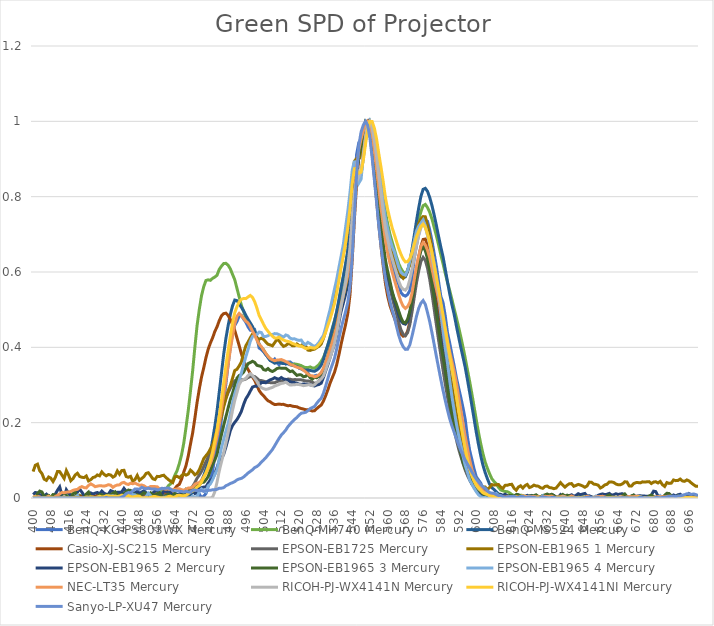
| Category | BenQ-KG-PS303WX | BenQ-MH740 | BenQ-MS524 | Casio-XJ-SC215 | EPSON-EB1725 | EPSON-EB1965 1 | EPSON-EB1965 2 | EPSON-EB1965 3 | EPSON-EB1965 4 | NEC-LT35 | RICOH-PJ-WX4141N | RICOH-PJ-WX4141NI | Sanyo-LP-XU47 |
|---|---|---|---|---|---|---|---|---|---|---|---|---|---|
| 400.0 | 0 | 0 | 0 | 0 | 0.001 | 0.07 | 0.009 | 0 | 0 | 0.003 | 0.001 | 0.001 | 0 |
| 401.0 | 0 | 0 | 0 | 0 | 0.003 | 0.087 | 0.015 | 0 | 0 | 0.004 | 0 | 0.003 | 0 |
| 402.0 | 0 | 0 | 0 | 0 | 0 | 0.09 | 0.014 | 0.012 | 0 | 0.003 | 0 | 0 | 0 |
| 403.0 | 0 | 0 | 0 | 0 | 0 | 0.072 | 0.009 | 0.018 | 0 | 0.003 | 0 | 0 | 0 |
| 404.0 | 0 | 0 | 0 | 0.001 | 0.001 | 0.065 | 0.009 | 0.016 | 0 | 0 | 0.001 | 0 | 0 |
| 405.0 | 0 | 0 | 0 | 0 | 0 | 0.05 | 0.006 | 0.004 | 0 | 0 | 0 | 0 | 0 |
| 406.0 | 0 | 0.004 | 0 | 0 | 0 | 0.047 | 0.01 | 0.005 | 0 | 0.002 | 0 | 0 | 0 |
| 407.0 | 0 | 0.007 | 0 | 0.001 | 0 | 0.056 | 0.004 | 0.007 | 0.004 | 0.005 | 0 | 0.002 | 0 |
| 408.0 | 0 | 0.001 | 0 | 0 | 0 | 0.053 | 0.004 | 0.002 | 0 | 0.001 | 0 | 0.002 | 0 |
| 409.0 | 0 | 0 | 0 | 0.001 | 0 | 0.044 | 0.005 | 0.009 | 0 | 0 | 0 | 0.001 | 0 |
| 410.0 | 0 | 0 | 0 | 0.003 | 0 | 0.054 | 0.01 | 0.008 | 0 | 0.004 | 0 | 0 | 0 |
| 411.0 | 0 | 0.007 | 0 | 0.003 | 0.002 | 0.07 | 0.021 | 0 | 0 | 0.007 | 0 | 0 | 0 |
| 412.0 | 0 | 0.005 | 0 | 0.002 | 0.005 | 0.07 | 0.029 | 0.004 | 0 | 0.011 | 0 | 0 | 0 |
| 413.0 | 0 | 0 | 0 | 0.001 | 0.001 | 0.061 | 0.008 | 0.001 | 0 | 0.015 | 0 | 0 | 0 |
| 414.0 | 0 | 0.001 | 0 | 0.001 | 0 | 0.052 | 0 | 0.008 | 0 | 0.014 | 0.004 | 0 | 0 |
| 415.0 | 0 | 0.006 | 0 | 0.001 | 0.001 | 0.073 | 0.022 | 0.005 | 0 | 0.016 | 0 | 0 | 0 |
| 416.0 | 0 | 0.007 | 0 | 0 | 0 | 0.061 | 0.013 | 0 | 0 | 0.016 | 0 | 0 | 0 |
| 417.0 | 0 | 0.01 | 0 | 0 | 0 | 0.046 | 0.007 | 0 | 0 | 0.017 | 0 | 0 | 0 |
| 418.0 | 0 | 0.004 | 0 | 0 | 0 | 0.051 | 0.002 | 0.011 | 0 | 0.02 | 0 | 0.001 | 0 |
| 419.0 | 0 | 0 | 0 | 0 | 0 | 0.061 | 0.004 | 0.016 | 0.001 | 0.022 | 0 | 0.002 | 0 |
| 420.0 | 0 | 0.002 | 0 | 0.002 | 0 | 0.066 | 0.016 | 0.001 | 0.007 | 0.023 | 0 | 0.001 | 0 |
| 421.0 | 0 | 0.007 | 0 | 0.005 | 0 | 0.057 | 0.024 | 0 | 0 | 0.028 | 0 | 0.001 | 0 |
| 422.0 | 0 | 0.005 | 0 | 0.004 | 0 | 0.055 | 0.016 | 0 | 0 | 0.03 | 0 | 0 | 0 |
| 423.0 | 0 | 0.002 | 0 | 0.001 | 0 | 0.054 | 0.007 | 0 | 0 | 0.028 | 0 | 0 | 0 |
| 424.0 | 0 | 0.003 | 0 | 0.001 | 0 | 0.058 | 0.007 | 0.01 | 0 | 0.027 | 0 | 0.003 | 0 |
| 425.0 | 0 | 0.008 | 0 | 0.004 | 0.001 | 0.045 | 0.008 | 0.016 | 0 | 0.033 | 0 | 0.002 | 0 |
| 426.0 | 0 | 0.009 | 0 | 0.009 | 0.001 | 0.049 | 0.013 | 0.002 | 0 | 0.038 | 0 | 0.003 | 0 |
| 427.0 | 0 | 0.006 | 0 | 0.006 | 0 | 0.054 | 0.01 | 0 | 0 | 0.034 | 0 | 0.002 | 0 |
| 428.0 | 0 | 0.002 | 0 | 0.003 | 0.001 | 0.056 | 0.013 | 0 | 0 | 0.03 | 0 | 0 | 0 |
| 429.0 | 0 | 0.003 | 0 | 0.008 | 0.003 | 0.061 | 0.015 | 0 | 0 | 0.031 | 0 | 0.002 | 0 |
| 430.0 | 0 | 0.009 | 0.001 | 0.007 | 0.003 | 0.059 | 0.011 | 0.009 | 0 | 0.033 | 0 | 0.005 | 0 |
| 431.0 | 0 | 0.009 | 0 | 0.004 | 0.004 | 0.069 | 0.018 | 0.008 | 0 | 0.032 | 0 | 0.003 | 0 |
| 432.0 | 0 | 0.005 | 0 | 0.006 | 0.005 | 0.063 | 0.013 | 0.003 | 0 | 0.031 | 0 | 0.003 | 0 |
| 433.0 | 0 | 0.006 | 0.001 | 0.008 | 0.007 | 0.059 | 0.01 | 0.007 | 0 | 0.033 | 0 | 0.006 | 0.001 |
| 434.0 | 0 | 0.007 | 0 | 0.009 | 0.007 | 0.062 | 0.01 | 0.008 | 0.006 | 0.035 | 0 | 0.005 | 0 |
| 435.0 | 0 | 0.007 | 0 | 0.01 | 0.009 | 0.061 | 0.02 | 0.008 | 0.005 | 0.034 | 0 | 0.004 | 0 |
| 436.0 | 0 | 0.003 | 0 | 0.009 | 0.011 | 0.055 | 0.017 | 0.013 | 0.006 | 0.028 | 0 | 0.004 | 0 |
| 437.0 | 0 | 0 | 0 | 0.01 | 0.011 | 0.059 | 0.008 | 0.016 | 0 | 0.032 | 0 | 0.005 | 0 |
| 438.0 | 0 | 0.002 | 0 | 0.009 | 0.013 | 0.072 | 0.015 | 0.008 | 0 | 0.034 | 0 | 0.004 | 0 |
| 439.0 | 0 | 0.009 | 0 | 0.009 | 0.014 | 0.063 | 0.015 | 0.003 | 0 | 0.035 | 0 | 0.005 | 0 |
| 440.0 | 0 | 0.01 | 0 | 0.01 | 0.015 | 0.073 | 0.016 | 0.008 | 0.003 | 0.04 | 0 | 0.007 | 0.002 |
| 441.0 | 0 | 0.007 | 0 | 0.013 | 0.011 | 0.074 | 0.026 | 0.011 | 0.001 | 0.041 | 0 | 0.006 | 0.005 |
| 442.0 | 0 | 0.005 | 0.002 | 0.013 | 0.011 | 0.057 | 0.018 | 0.017 | 0 | 0.038 | 0 | 0.006 | 0.012 |
| 443.0 | 0 | 0.004 | 0 | 0.01 | 0.013 | 0.055 | 0.01 | 0.021 | 0.004 | 0.036 | 0 | 0.007 | 0.014 |
| 444.0 | 0 | 0.007 | 0 | 0.011 | 0.013 | 0.057 | 0.019 | 0.02 | 0.013 | 0.039 | 0 | 0.004 | 0.014 |
| 445.0 | 0 | 0.007 | 0 | 0.01 | 0.014 | 0.044 | 0.013 | 0.012 | 0.009 | 0.038 | 0 | 0.003 | 0.019 |
| 446.0 | 0 | 0.01 | 0.003 | 0.01 | 0.014 | 0.049 | 0.011 | 0.009 | 0.008 | 0.04 | 0 | 0.004 | 0.024 |
| 447.0 | 0 | 0.009 | 0.003 | 0.012 | 0.014 | 0.06 | 0.019 | 0.009 | 0.003 | 0.036 | 0 | 0.005 | 0.024 |
| 448.0 | 0 | 0.008 | 0.003 | 0.011 | 0.012 | 0.047 | 0.012 | 0.006 | 0 | 0.034 | 0 | 0.005 | 0.023 |
| 449.0 | 0 | 0.015 | 0.005 | 0.01 | 0.012 | 0.052 | 0.016 | 0.01 | 0 | 0.034 | 0 | 0 | 0.028 |
| 450.0 | 0 | 0.017 | 0.005 | 0.008 | 0.011 | 0.057 | 0.019 | 0.014 | 0 | 0.033 | 0 | 0 | 0.026 |
| 451.0 | 0 | 0.013 | 0 | 0.009 | 0.011 | 0.065 | 0.014 | 0.011 | 0.004 | 0.028 | 0 | 0.001 | 0.024 |
| 452.0 | 0 | 0.011 | 0 | 0.012 | 0.01 | 0.067 | 0.007 | 0.011 | 0.013 | 0.026 | 0 | 0 | 0.026 |
| 453.0 | 0 | 0.01 | 0 | 0.012 | 0.008 | 0.06 | 0.01 | 0.014 | 0.007 | 0.031 | 0 | 0.002 | 0.024 |
| 454.0 | 0 | 0.012 | 0 | 0.01 | 0.007 | 0.051 | 0.013 | 0.009 | 0 | 0.03 | 0 | 0.004 | 0.024 |
| 455.0 | 0 | 0.014 | 0 | 0.011 | 0.008 | 0.049 | 0.018 | 0.007 | 0 | 0.03 | 0 | 0.004 | 0.024 |
| 456.0 | 0 | 0.016 | 0 | 0.01 | 0.007 | 0.057 | 0.022 | 0.011 | 0 | 0.03 | 0 | 0.002 | 0.022 |
| 457.0 | 0 | 0.018 | 0 | 0.007 | 0.006 | 0.057 | 0.012 | 0.014 | 0 | 0.024 | 0 | 0.001 | 0.022 |
| 458.0 | 0 | 0.02 | 0.002 | 0.011 | 0.006 | 0.059 | 0.01 | 0.005 | 0 | 0.025 | 0 | 0 | 0.026 |
| 459.0 | 0 | 0.019 | 0 | 0.013 | 0.008 | 0.06 | 0.018 | 0.001 | 0.002 | 0.024 | 0 | 0 | 0.025 |
| 460.0 | 0 | 0.022 | 0 | 0.012 | 0.007 | 0.054 | 0.018 | 0.007 | 0.003 | 0.023 | 0 | 0.001 | 0.026 |
| 461.0 | 0 | 0.032 | 0 | 0.016 | 0.009 | 0.049 | 0.016 | 0.01 | 0 | 0.025 | 0 | 0.004 | 0.027 |
| 462.0 | 0 | 0.037 | 0 | 0.017 | 0.01 | 0.045 | 0.014 | 0.005 | 0 | 0.024 | 0 | 0.005 | 0.024 |
| 463.0 | 0 | 0.047 | 0.001 | 0.018 | 0.009 | 0.041 | 0.007 | 0.006 | 0 | 0.022 | 0 | 0.002 | 0.019 |
| 464.0 | 0 | 0.061 | 0.001 | 0.025 | 0.01 | 0.056 | 0.006 | 0.014 | 0.003 | 0.023 | 0 | 0.002 | 0.02 |
| 465.0 | 0 | 0.073 | 0 | 0.032 | 0.008 | 0.058 | 0.009 | 0.007 | 0 | 0.024 | 0 | 0.007 | 0.019 |
| 466.0 | 0 | 0.092 | 0 | 0.036 | 0.008 | 0.054 | 0.009 | 0 | 0 | 0.024 | 0 | 0.007 | 0.018 |
| 467.0 | 0 | 0.115 | 0.002 | 0.05 | 0.009 | 0.059 | 0.017 | 0.004 | 0 | 0.022 | 0 | 0.006 | 0.017 |
| 468.0 | 0 | 0.146 | 0.005 | 0.069 | 0.012 | 0.064 | 0.018 | 0.015 | 0 | 0.021 | 0 | 0.006 | 0.016 |
| 469.0 | 0 | 0.187 | 0.005 | 0.086 | 0.017 | 0.061 | 0.016 | 0.023 | 0 | 0.023 | 0 | 0.007 | 0.018 |
| 470.0 | 0 | 0.232 | 0.005 | 0.111 | 0.019 | 0.063 | 0.02 | 0.021 | 0 | 0.026 | 0 | 0.011 | 0.016 |
| 471.0 | 0 | 0.283 | 0.009 | 0.143 | 0.024 | 0.074 | 0.022 | 0.018 | 0 | 0.027 | 0 | 0.016 | 0.015 |
| 472.0 | 0 | 0.338 | 0.016 | 0.173 | 0.031 | 0.069 | 0.02 | 0.019 | 0.004 | 0.029 | 0 | 0.018 | 0.02 |
| 473.0 | 0 | 0.4 | 0.022 | 0.212 | 0.041 | 0.062 | 0.012 | 0.026 | 0.003 | 0.037 | 0 | 0.023 | 0.021 |
| 474.0 | 0 | 0.458 | 0.025 | 0.254 | 0.052 | 0.065 | 0.013 | 0.032 | 0.004 | 0.04 | 0 | 0.029 | 0.02 |
| 475.0 | 0.011 | 0.501 | 0.033 | 0.29 | 0.061 | 0.075 | 0.025 | 0.038 | 0.017 | 0.041 | 0 | 0.033 | 0.02 |
| 476.0 | 0.001 | 0.537 | 0.045 | 0.321 | 0.07 | 0.089 | 0.027 | 0.041 | 0.024 | 0.047 | 0 | 0.042 | 0.02 |
| 477.0 | 0.005 | 0.561 | 0.06 | 0.346 | 0.083 | 0.105 | 0.029 | 0.042 | 0.019 | 0.056 | 0 | 0.055 | 0.018 |
| 478.0 | 0.012 | 0.578 | 0.077 | 0.372 | 0.096 | 0.112 | 0.029 | 0.048 | 0.017 | 0.065 | 0 | 0.067 | 0.02 |
| 479.0 | 0.03 | 0.579 | 0.096 | 0.395 | 0.109 | 0.119 | 0.04 | 0.057 | 0.032 | 0.078 | 0 | 0.082 | 0.02 |
| 480.0 | 0.05 | 0.578 | 0.121 | 0.411 | 0.121 | 0.13 | 0.047 | 0.073 | 0.037 | 0.092 | 0 | 0.1 | 0.02 |
| 481.0 | 0.07 | 0.583 | 0.154 | 0.425 | 0.137 | 0.141 | 0.052 | 0.09 | 0.049 | 0.109 | 0.002 | 0.123 | 0.022 |
| 482.0 | 0.11 | 0.587 | 0.19 | 0.442 | 0.157 | 0.159 | 0.063 | 0.101 | 0.063 | 0.137 | 0.016 | 0.151 | 0.022 |
| 483.0 | 0.138 | 0.591 | 0.231 | 0.454 | 0.177 | 0.182 | 0.081 | 0.116 | 0.074 | 0.163 | 0.042 | 0.181 | 0.023 |
| 484.0 | 0.164 | 0.607 | 0.281 | 0.471 | 0.201 | 0.199 | 0.098 | 0.142 | 0.105 | 0.195 | 0.072 | 0.218 | 0.026 |
| 485.0 | 0.21 | 0.615 | 0.331 | 0.484 | 0.224 | 0.217 | 0.104 | 0.168 | 0.133 | 0.235 | 0.095 | 0.259 | 0.026 |
| 486.0 | 0.258 | 0.623 | 0.381 | 0.489 | 0.246 | 0.242 | 0.116 | 0.193 | 0.155 | 0.275 | 0.119 | 0.305 | 0.027 |
| 487.0 | 0.303 | 0.623 | 0.423 | 0.491 | 0.265 | 0.264 | 0.135 | 0.216 | 0.177 | 0.312 | 0.146 | 0.351 | 0.033 |
| 488.0 | 0.353 | 0.618 | 0.457 | 0.484 | 0.28 | 0.285 | 0.157 | 0.239 | 0.197 | 0.354 | 0.173 | 0.391 | 0.035 |
| 489.0 | 0.401 | 0.608 | 0.487 | 0.474 | 0.292 | 0.299 | 0.179 | 0.261 | 0.224 | 0.394 | 0.202 | 0.43 | 0.039 |
| 490.0 | 0.437 | 0.594 | 0.51 | 0.461 | 0.302 | 0.318 | 0.192 | 0.278 | 0.252 | 0.43 | 0.233 | 0.465 | 0.041 |
| 491.0 | 0.458 | 0.579 | 0.525 | 0.445 | 0.311 | 0.338 | 0.201 | 0.299 | 0.277 | 0.463 | 0.259 | 0.492 | 0.043 |
| 492.0 | 0.468 | 0.556 | 0.524 | 0.425 | 0.311 | 0.342 | 0.208 | 0.318 | 0.294 | 0.483 | 0.28 | 0.508 | 0.048 |
| 493.0 | 0.483 | 0.534 | 0.516 | 0.405 | 0.312 | 0.351 | 0.218 | 0.325 | 0.313 | 0.49 | 0.301 | 0.521 | 0.051 |
| 494.0 | 0.485 | 0.512 | 0.506 | 0.383 | 0.314 | 0.361 | 0.23 | 0.328 | 0.332 | 0.484 | 0.311 | 0.528 | 0.052 |
| 495.0 | 0.475 | 0.495 | 0.497 | 0.365 | 0.314 | 0.385 | 0.248 | 0.334 | 0.355 | 0.476 | 0.315 | 0.53 | 0.056 |
| 496.0 | 0.467 | 0.48 | 0.485 | 0.351 | 0.316 | 0.404 | 0.263 | 0.346 | 0.375 | 0.47 | 0.317 | 0.529 | 0.061 |
| 497.0 | 0.454 | 0.469 | 0.474 | 0.341 | 0.32 | 0.414 | 0.272 | 0.357 | 0.394 | 0.465 | 0.325 | 0.534 | 0.066 |
| 498.0 | 0.445 | 0.462 | 0.465 | 0.331 | 0.322 | 0.425 | 0.284 | 0.359 | 0.416 | 0.455 | 0.33 | 0.538 | 0.07 |
| 499.0 | 0.444 | 0.452 | 0.455 | 0.321 | 0.324 | 0.435 | 0.294 | 0.363 | 0.429 | 0.443 | 0.325 | 0.533 | 0.075 |
| 500.0 | 0.447 | 0.442 | 0.441 | 0.312 | 0.322 | 0.435 | 0.297 | 0.36 | 0.432 | 0.432 | 0.317 | 0.521 | 0.081 |
| 501.0 | 0.426 | 0.425 | 0.424 | 0.299 | 0.318 | 0.424 | 0.297 | 0.352 | 0.434 | 0.419 | 0.309 | 0.504 | 0.084 |
| 502.0 | 0.398 | 0.407 | 0.408 | 0.285 | 0.312 | 0.422 | 0.299 | 0.351 | 0.441 | 0.408 | 0.298 | 0.485 | 0.088 |
| 503.0 | 0.394 | 0.4 | 0.398 | 0.277 | 0.312 | 0.424 | 0.307 | 0.349 | 0.439 | 0.402 | 0.293 | 0.473 | 0.095 |
| 504.0 | 0.388 | 0.394 | 0.39 | 0.272 | 0.31 | 0.421 | 0.307 | 0.341 | 0.429 | 0.392 | 0.29 | 0.461 | 0.101 |
| 505.0 | 0.38 | 0.383 | 0.382 | 0.264 | 0.308 | 0.414 | 0.306 | 0.339 | 0.429 | 0.384 | 0.288 | 0.45 | 0.107 |
| 506.0 | 0.375 | 0.376 | 0.372 | 0.258 | 0.307 | 0.408 | 0.31 | 0.344 | 0.431 | 0.376 | 0.289 | 0.443 | 0.114 |
| 507.0 | 0.366 | 0.37 | 0.365 | 0.255 | 0.306 | 0.406 | 0.314 | 0.338 | 0.434 | 0.37 | 0.292 | 0.435 | 0.121 |
| 508.0 | 0.363 | 0.364 | 0.362 | 0.251 | 0.306 | 0.404 | 0.316 | 0.336 | 0.434 | 0.367 | 0.294 | 0.429 | 0.129 |
| 509.0 | 0.369 | 0.362 | 0.358 | 0.248 | 0.306 | 0.412 | 0.319 | 0.339 | 0.436 | 0.365 | 0.297 | 0.425 | 0.138 |
| 510.0 | 0.36 | 0.362 | 0.359 | 0.249 | 0.309 | 0.42 | 0.317 | 0.343 | 0.436 | 0.366 | 0.299 | 0.425 | 0.149 |
| 511.0 | 0.354 | 0.362 | 0.361 | 0.249 | 0.311 | 0.417 | 0.316 | 0.345 | 0.433 | 0.367 | 0.301 | 0.427 | 0.158 |
| 512.0 | 0.364 | 0.36 | 0.358 | 0.249 | 0.31 | 0.409 | 0.32 | 0.345 | 0.43 | 0.368 | 0.304 | 0.423 | 0.167 |
| 513.0 | 0.362 | 0.357 | 0.357 | 0.249 | 0.312 | 0.402 | 0.316 | 0.344 | 0.427 | 0.365 | 0.305 | 0.419 | 0.173 |
| 514.0 | 0.356 | 0.357 | 0.357 | 0.247 | 0.314 | 0.405 | 0.315 | 0.345 | 0.433 | 0.362 | 0.308 | 0.417 | 0.18 |
| 515.0 | 0.361 | 0.359 | 0.356 | 0.245 | 0.316 | 0.409 | 0.313 | 0.34 | 0.431 | 0.359 | 0.304 | 0.416 | 0.189 |
| 516.0 | 0.361 | 0.356 | 0.354 | 0.246 | 0.315 | 0.409 | 0.308 | 0.336 | 0.424 | 0.355 | 0.3 | 0.414 | 0.196 |
| 517.0 | 0.356 | 0.354 | 0.352 | 0.244 | 0.314 | 0.404 | 0.307 | 0.337 | 0.422 | 0.353 | 0.3 | 0.41 | 0.203 |
| 518.0 | 0.355 | 0.356 | 0.351 | 0.243 | 0.314 | 0.404 | 0.306 | 0.331 | 0.423 | 0.35 | 0.301 | 0.409 | 0.209 |
| 519.0 | 0.35 | 0.355 | 0.349 | 0.242 | 0.314 | 0.409 | 0.305 | 0.325 | 0.42 | 0.347 | 0.302 | 0.406 | 0.213 |
| 520.0 | 0.345 | 0.353 | 0.346 | 0.239 | 0.314 | 0.405 | 0.302 | 0.327 | 0.418 | 0.345 | 0.301 | 0.403 | 0.22 |
| 521.0 | 0.35 | 0.351 | 0.343 | 0.238 | 0.314 | 0.404 | 0.301 | 0.327 | 0.419 | 0.343 | 0.3 | 0.403 | 0.225 |
| 522.0 | 0.345 | 0.348 | 0.34 | 0.236 | 0.312 | 0.41 | 0.303 | 0.322 | 0.41 | 0.339 | 0.298 | 0.4 | 0.226 |
| 523.0 | 0.337 | 0.346 | 0.339 | 0.234 | 0.311 | 0.404 | 0.302 | 0.323 | 0.407 | 0.335 | 0.299 | 0.397 | 0.228 |
| 524.0 | 0.333 | 0.346 | 0.34 | 0.234 | 0.311 | 0.393 | 0.302 | 0.329 | 0.413 | 0.329 | 0.3 | 0.398 | 0.232 |
| 525.0 | 0.323 | 0.348 | 0.339 | 0.233 | 0.31 | 0.392 | 0.301 | 0.319 | 0.41 | 0.325 | 0.3 | 0.399 | 0.237 |
| 526.0 | 0.321 | 0.345 | 0.337 | 0.231 | 0.307 | 0.394 | 0.299 | 0.316 | 0.405 | 0.324 | 0.298 | 0.399 | 0.24 |
| 527.0 | 0.324 | 0.345 | 0.336 | 0.232 | 0.304 | 0.395 | 0.297 | 0.32 | 0.403 | 0.322 | 0.3 | 0.398 | 0.243 |
| 528.0 | 0.326 | 0.349 | 0.34 | 0.237 | 0.306 | 0.399 | 0.3 | 0.319 | 0.406 | 0.323 | 0.307 | 0.401 | 0.252 |
| 529.0 | 0.322 | 0.354 | 0.345 | 0.242 | 0.311 | 0.403 | 0.301 | 0.324 | 0.413 | 0.327 | 0.311 | 0.407 | 0.259 |
| 530.0 | 0.326 | 0.363 | 0.352 | 0.247 | 0.319 | 0.409 | 0.305 | 0.331 | 0.423 | 0.333 | 0.316 | 0.415 | 0.264 |
| 531.0 | 0.338 | 0.373 | 0.367 | 0.257 | 0.331 | 0.423 | 0.32 | 0.341 | 0.431 | 0.344 | 0.324 | 0.425 | 0.278 |
| 532.0 | 0.352 | 0.388 | 0.388 | 0.271 | 0.349 | 0.443 | 0.337 | 0.358 | 0.452 | 0.36 | 0.339 | 0.44 | 0.297 |
| 533.0 | 0.37 | 0.406 | 0.406 | 0.287 | 0.369 | 0.468 | 0.354 | 0.377 | 0.477 | 0.377 | 0.357 | 0.458 | 0.317 |
| 534.0 | 0.4 | 0.427 | 0.425 | 0.305 | 0.389 | 0.489 | 0.373 | 0.395 | 0.5 | 0.394 | 0.372 | 0.475 | 0.337 |
| 535.0 | 0.423 | 0.45 | 0.448 | 0.319 | 0.409 | 0.51 | 0.391 | 0.417 | 0.527 | 0.414 | 0.391 | 0.494 | 0.354 |
| 536.0 | 0.439 | 0.471 | 0.469 | 0.334 | 0.426 | 0.536 | 0.408 | 0.439 | 0.554 | 0.434 | 0.41 | 0.516 | 0.371 |
| 537.0 | 0.466 | 0.494 | 0.495 | 0.354 | 0.449 | 0.558 | 0.432 | 0.459 | 0.58 | 0.456 | 0.437 | 0.544 | 0.396 |
| 538.0 | 0.499 | 0.522 | 0.526 | 0.38 | 0.478 | 0.586 | 0.466 | 0.486 | 0.612 | 0.484 | 0.473 | 0.578 | 0.424 |
| 539.0 | 0.529 | 0.556 | 0.559 | 0.408 | 0.507 | 0.62 | 0.496 | 0.514 | 0.642 | 0.513 | 0.509 | 0.611 | 0.451 |
| 540.0 | 0.555 | 0.585 | 0.589 | 0.435 | 0.532 | 0.646 | 0.518 | 0.536 | 0.673 | 0.539 | 0.539 | 0.643 | 0.473 |
| 541.0 | 0.586 | 0.616 | 0.621 | 0.46 | 0.554 | 0.678 | 0.541 | 0.559 | 0.718 | 0.564 | 0.573 | 0.677 | 0.494 |
| 542.0 | 0.618 | 0.654 | 0.657 | 0.489 | 0.58 | 0.718 | 0.567 | 0.586 | 0.761 | 0.591 | 0.614 | 0.718 | 0.519 |
| 543.0 | 0.663 | 0.701 | 0.711 | 0.539 | 0.626 | 0.774 | 0.607 | 0.625 | 0.811 | 0.631 | 0.665 | 0.769 | 0.56 |
| 544.0 | 0.747 | 0.772 | 0.788 | 0.632 | 0.714 | 0.851 | 0.693 | 0.705 | 0.869 | 0.706 | 0.748 | 0.834 | 0.64 |
| 545.0 | 0.84 | 0.839 | 0.845 | 0.741 | 0.806 | 0.894 | 0.791 | 0.798 | 0.895 | 0.799 | 0.814 | 0.874 | 0.75 |
| 546.0 | 0.912 | 0.881 | 0.859 | 0.836 | 0.868 | 0.901 | 0.865 | 0.867 | 0.872 | 0.876 | 0.84 | 0.874 | 0.859 |
| 547.0 | 0.944 | 0.902 | 0.853 | 0.905 | 0.904 | 0.901 | 0.916 | 0.908 | 0.836 | 0.925 | 0.852 | 0.862 | 0.937 |
| 548.0 | 0.95 | 0.915 | 0.861 | 0.945 | 0.931 | 0.907 | 0.943 | 0.932 | 0.846 | 0.953 | 0.87 | 0.865 | 0.971 |
| 549.0 | 0.967 | 0.942 | 0.903 | 0.975 | 0.965 | 0.937 | 0.97 | 0.971 | 0.907 | 0.974 | 0.912 | 0.896 | 0.99 |
| 550.0 | 0.983 | 0.972 | 0.95 | 0.998 | 0.993 | 0.979 | 0.995 | 1 | 0.953 | 0.992 | 0.96 | 0.939 | 1 |
| 551.0 | 1 | 0.991 | 0.983 | 1 | 1 | 1 | 1 | 0.995 | 0.984 | 1 | 0.994 | 0.978 | 0.989 |
| 552.0 | 0.995 | 1 | 1 | 0.969 | 0.981 | 0.999 | 0.976 | 0.978 | 1 | 0.991 | 1 | 1 | 0.955 |
| 553.0 | 0.965 | 0.986 | 0.99 | 0.914 | 0.939 | 0.989 | 0.93 | 0.944 | 0.984 | 0.962 | 0.983 | 1 | 0.903 |
| 554.0 | 0.926 | 0.955 | 0.961 | 0.855 | 0.883 | 0.959 | 0.88 | 0.89 | 0.956 | 0.92 | 0.948 | 0.982 | 0.845 |
| 555.0 | 0.87 | 0.923 | 0.919 | 0.792 | 0.826 | 0.916 | 0.824 | 0.834 | 0.926 | 0.872 | 0.906 | 0.953 | 0.785 |
| 556.0 | 0.816 | 0.88 | 0.871 | 0.726 | 0.767 | 0.864 | 0.764 | 0.773 | 0.879 | 0.821 | 0.856 | 0.914 | 0.723 |
| 557.0 | 0.776 | 0.837 | 0.826 | 0.668 | 0.713 | 0.825 | 0.712 | 0.724 | 0.83 | 0.771 | 0.81 | 0.878 | 0.669 |
| 558.0 | 0.739 | 0.797 | 0.78 | 0.616 | 0.665 | 0.783 | 0.659 | 0.676 | 0.785 | 0.726 | 0.76 | 0.84 | 0.622 |
| 559.0 | 0.701 | 0.759 | 0.738 | 0.57 | 0.619 | 0.734 | 0.621 | 0.631 | 0.743 | 0.685 | 0.716 | 0.797 | 0.582 |
| 560.0 | 0.667 | 0.728 | 0.706 | 0.536 | 0.585 | 0.701 | 0.592 | 0.602 | 0.714 | 0.65 | 0.687 | 0.766 | 0.551 |
| 561.0 | 0.647 | 0.701 | 0.681 | 0.512 | 0.558 | 0.674 | 0.567 | 0.576 | 0.688 | 0.624 | 0.658 | 0.741 | 0.522 |
| 562.0 | 0.627 | 0.68 | 0.656 | 0.494 | 0.533 | 0.652 | 0.546 | 0.549 | 0.668 | 0.601 | 0.636 | 0.718 | 0.5 |
| 563.0 | 0.596 | 0.661 | 0.634 | 0.478 | 0.51 | 0.635 | 0.524 | 0.529 | 0.654 | 0.58 | 0.616 | 0.7 | 0.481 |
| 564.0 | 0.58 | 0.64 | 0.618 | 0.462 | 0.489 | 0.621 | 0.507 | 0.514 | 0.633 | 0.56 | 0.597 | 0.681 | 0.455 |
| 565.0 | 0.567 | 0.622 | 0.6 | 0.447 | 0.466 | 0.604 | 0.486 | 0.496 | 0.613 | 0.54 | 0.576 | 0.662 | 0.432 |
| 566.0 | 0.545 | 0.609 | 0.587 | 0.435 | 0.447 | 0.591 | 0.47 | 0.479 | 0.599 | 0.522 | 0.561 | 0.647 | 0.414 |
| 567.0 | 0.539 | 0.6 | 0.585 | 0.429 | 0.435 | 0.583 | 0.464 | 0.467 | 0.594 | 0.509 | 0.554 | 0.634 | 0.401 |
| 568.0 | 0.536 | 0.595 | 0.587 | 0.432 | 0.431 | 0.591 | 0.461 | 0.465 | 0.592 | 0.503 | 0.552 | 0.627 | 0.395 |
| 569.0 | 0.54 | 0.604 | 0.601 | 0.443 | 0.439 | 0.605 | 0.469 | 0.475 | 0.605 | 0.508 | 0.559 | 0.627 | 0.395 |
| 570.0 | 0.551 | 0.625 | 0.627 | 0.467 | 0.46 | 0.62 | 0.492 | 0.495 | 0.628 | 0.52 | 0.58 | 0.635 | 0.407 |
| 571.0 | 0.586 | 0.651 | 0.661 | 0.505 | 0.495 | 0.649 | 0.525 | 0.526 | 0.652 | 0.544 | 0.608 | 0.651 | 0.43 |
| 572.0 | 0.636 | 0.679 | 0.697 | 0.547 | 0.533 | 0.678 | 0.564 | 0.559 | 0.682 | 0.58 | 0.638 | 0.673 | 0.456 |
| 573.0 | 0.671 | 0.709 | 0.736 | 0.593 | 0.571 | 0.705 | 0.604 | 0.599 | 0.709 | 0.615 | 0.669 | 0.694 | 0.482 |
| 574.0 | 0.7 | 0.737 | 0.77 | 0.635 | 0.603 | 0.729 | 0.64 | 0.632 | 0.721 | 0.643 | 0.697 | 0.708 | 0.504 |
| 575.0 | 0.725 | 0.76 | 0.801 | 0.668 | 0.628 | 0.74 | 0.664 | 0.657 | 0.73 | 0.668 | 0.717 | 0.721 | 0.517 |
| 576.0 | 0.735 | 0.776 | 0.82 | 0.686 | 0.639 | 0.747 | 0.672 | 0.667 | 0.738 | 0.678 | 0.729 | 0.727 | 0.524 |
| 577.0 | 0.739 | 0.779 | 0.822 | 0.688 | 0.631 | 0.747 | 0.668 | 0.656 | 0.723 | 0.671 | 0.719 | 0.718 | 0.514 |
| 578.0 | 0.734 | 0.771 | 0.814 | 0.672 | 0.61 | 0.723 | 0.645 | 0.635 | 0.698 | 0.658 | 0.697 | 0.701 | 0.492 |
| 579.0 | 0.711 | 0.758 | 0.797 | 0.646 | 0.58 | 0.695 | 0.614 | 0.603 | 0.676 | 0.638 | 0.673 | 0.677 | 0.468 |
| 580.0 | 0.682 | 0.741 | 0.776 | 0.616 | 0.542 | 0.663 | 0.58 | 0.57 | 0.65 | 0.609 | 0.64 | 0.651 | 0.439 |
| 581.0 | 0.649 | 0.718 | 0.751 | 0.581 | 0.501 | 0.614 | 0.538 | 0.532 | 0.621 | 0.58 | 0.607 | 0.62 | 0.407 |
| 582.0 | 0.615 | 0.696 | 0.724 | 0.541 | 0.46 | 0.575 | 0.498 | 0.492 | 0.577 | 0.555 | 0.574 | 0.587 | 0.376 |
| 583.0 | 0.574 | 0.672 | 0.694 | 0.503 | 0.419 | 0.545 | 0.461 | 0.449 | 0.532 | 0.529 | 0.542 | 0.553 | 0.345 |
| 584.0 | 0.535 | 0.646 | 0.666 | 0.465 | 0.379 | 0.504 | 0.422 | 0.408 | 0.489 | 0.503 | 0.508 | 0.519 | 0.315 |
| 585.0 | 0.519 | 0.622 | 0.64 | 0.425 | 0.339 | 0.463 | 0.385 | 0.375 | 0.443 | 0.475 | 0.476 | 0.486 | 0.286 |
| 586.0 | 0.483 | 0.596 | 0.607 | 0.387 | 0.302 | 0.415 | 0.343 | 0.338 | 0.399 | 0.447 | 0.441 | 0.45 | 0.259 |
| 587.0 | 0.439 | 0.572 | 0.574 | 0.347 | 0.268 | 0.367 | 0.303 | 0.296 | 0.359 | 0.417 | 0.404 | 0.413 | 0.233 |
| 588.0 | 0.411 | 0.551 | 0.542 | 0.307 | 0.236 | 0.334 | 0.271 | 0.253 | 0.312 | 0.388 | 0.371 | 0.378 | 0.21 |
| 589.0 | 0.381 | 0.527 | 0.513 | 0.271 | 0.207 | 0.303 | 0.237 | 0.222 | 0.269 | 0.362 | 0.34 | 0.346 | 0.191 |
| 590.0 | 0.351 | 0.503 | 0.488 | 0.236 | 0.181 | 0.266 | 0.205 | 0.198 | 0.233 | 0.337 | 0.308 | 0.311 | 0.175 |
| 591.0 | 0.32 | 0.479 | 0.458 | 0.201 | 0.155 | 0.226 | 0.177 | 0.169 | 0.198 | 0.306 | 0.272 | 0.273 | 0.158 |
| 592.0 | 0.293 | 0.454 | 0.428 | 0.167 | 0.131 | 0.194 | 0.15 | 0.143 | 0.167 | 0.269 | 0.237 | 0.234 | 0.141 |
| 593.0 | 0.267 | 0.428 | 0.4 | 0.139 | 0.111 | 0.164 | 0.122 | 0.12 | 0.142 | 0.235 | 0.203 | 0.197 | 0.125 |
| 594.0 | 0.24 | 0.401 | 0.374 | 0.115 | 0.092 | 0.142 | 0.098 | 0.095 | 0.111 | 0.198 | 0.168 | 0.162 | 0.113 |
| 595.0 | 0.209 | 0.371 | 0.347 | 0.092 | 0.074 | 0.126 | 0.085 | 0.079 | 0.086 | 0.163 | 0.133 | 0.131 | 0.101 |
| 596.0 | 0.162 | 0.34 | 0.314 | 0.075 | 0.06 | 0.104 | 0.07 | 0.07 | 0.068 | 0.132 | 0.101 | 0.103 | 0.09 |
| 597.0 | 0.127 | 0.309 | 0.28 | 0.062 | 0.048 | 0.078 | 0.051 | 0.057 | 0.048 | 0.101 | 0.077 | 0.078 | 0.08 |
| 598.0 | 0.102 | 0.277 | 0.246 | 0.049 | 0.037 | 0.063 | 0.037 | 0.043 | 0.037 | 0.076 | 0.062 | 0.059 | 0.069 |
| 599.0 | 0.077 | 0.242 | 0.21 | 0.039 | 0.029 | 0.058 | 0.031 | 0.033 | 0.026 | 0.059 | 0.048 | 0.045 | 0.059 |
| 600.0 | 0.056 | 0.207 | 0.174 | 0.032 | 0.021 | 0.051 | 0.024 | 0.025 | 0.016 | 0.045 | 0.033 | 0.034 | 0.051 |
| 601.0 | 0.048 | 0.174 | 0.142 | 0.027 | 0.015 | 0.043 | 0.018 | 0.021 | 0.009 | 0.034 | 0.025 | 0.027 | 0.044 |
| 602.0 | 0.04 | 0.144 | 0.112 | 0.022 | 0.01 | 0.032 | 0.01 | 0.017 | 0.004 | 0.026 | 0.02 | 0.02 | 0.036 |
| 603.0 | 0.025 | 0.118 | 0.087 | 0.018 | 0.007 | 0.029 | 0.004 | 0.011 | 0.002 | 0.019 | 0.015 | 0.014 | 0.03 |
| 604.0 | 0.019 | 0.095 | 0.068 | 0.015 | 0.005 | 0.029 | 0.005 | 0.007 | 0.001 | 0.015 | 0.012 | 0.011 | 0.026 |
| 605.0 | 0.008 | 0.079 | 0.051 | 0.011 | 0.005 | 0.022 | 0.003 | 0.005 | 0 | 0.011 | 0.01 | 0.009 | 0.02 |
| 606.0 | 0.001 | 0.064 | 0.037 | 0.009 | 0.006 | 0.028 | 0.004 | 0.006 | 0 | 0.008 | 0.006 | 0.006 | 0.014 |
| 607.0 | 0 | 0.051 | 0.028 | 0.009 | 0.005 | 0.036 | 0.004 | 0.008 | 0.005 | 0.007 | 0.001 | 0.005 | 0.013 |
| 608.0 | 0 | 0.044 | 0.022 | 0.007 | 0.004 | 0.034 | 0.005 | 0.007 | 0.008 | 0.006 | 0 | 0.004 | 0.012 |
| 609.0 | 0 | 0.038 | 0.017 | 0.005 | 0.004 | 0.035 | 0.004 | 0.007 | 0.012 | 0.005 | 0.002 | 0.003 | 0.009 |
| 610.0 | 0 | 0.028 | 0.011 | 0.003 | 0.004 | 0.036 | 0.006 | 0.01 | 0.007 | 0.004 | 0.005 | 0.003 | 0.007 |
| 611.0 | 0 | 0.022 | 0.008 | 0.004 | 0.003 | 0.029 | 0.01 | 0.006 | 0 | 0.004 | 0.003 | 0.002 | 0.007 |
| 612.0 | 0 | 0.019 | 0.006 | 0.005 | 0.003 | 0.026 | 0.007 | 0 | 0 | 0.003 | 0.001 | 0.002 | 0.004 |
| 613.0 | 0 | 0.017 | 0.005 | 0.002 | 0.002 | 0.034 | 0.01 | 0 | 0.001 | 0.002 | 0 | 0.001 | 0.001 |
| 614.0 | 0 | 0.017 | 0.005 | 0.001 | 0.003 | 0.034 | 0.006 | 0.005 | 0 | 0.004 | 0 | 0.001 | 0.003 |
| 615.0 | 0 | 0.014 | 0.004 | 0.002 | 0.002 | 0.036 | 0.001 | 0.007 | 0 | 0.004 | 0.001 | 0.001 | 0.004 |
| 616.0 | 0 | 0.009 | 0.001 | 0.002 | 0.002 | 0.036 | 0.004 | 0.007 | 0 | 0.003 | 0 | 0.002 | 0.004 |
| 617.0 | 0 | 0.007 | 0 | 0.002 | 0.002 | 0.026 | 0.004 | 0.005 | 0 | 0.003 | 0 | 0.002 | 0.004 |
| 618.0 | 0 | 0.005 | 0 | 0.001 | 0.002 | 0.021 | 0.001 | 0.009 | 0 | 0.003 | 0 | 0.003 | 0.002 |
| 619.0 | 0 | 0.006 | 0 | 0 | 0.003 | 0.029 | 0.001 | 0.009 | 0 | 0.002 | 0.001 | 0.002 | 0.001 |
| 620.0 | 0 | 0.008 | 0 | 0.001 | 0.002 | 0.033 | 0.002 | 0.004 | 0.001 | 0.004 | 0.001 | 0 | 0.004 |
| 621.0 | 0 | 0.007 | 0 | 0.001 | 0.001 | 0.026 | 0 | 0 | 0 | 0.006 | 0 | 0 | 0.004 |
| 622.0 | 0 | 0.004 | 0 | 0 | 0.001 | 0.033 | 0.005 | 0 | 0 | 0.004 | 0 | 0.002 | 0.001 |
| 623.0 | 0 | 0.001 | 0 | 0.001 | 0.002 | 0.036 | 0.007 | 0.002 | 0 | 0.004 | 0.003 | 0.002 | 0.002 |
| 624.0 | 0 | 0.003 | 0 | 0.002 | 0.003 | 0.028 | 0.004 | 0.006 | 0 | 0.004 | 0.002 | 0 | 0.003 |
| 625.0 | 0 | 0.005 | 0 | 0 | 0.003 | 0.03 | 0.007 | 0.006 | 0 | 0.004 | 0 | 0.001 | 0.002 |
| 626.0 | 0 | 0.004 | 0 | 0 | 0.002 | 0.034 | 0.002 | 0.006 | 0 | 0.004 | 0.001 | 0 | 0.002 |
| 627.0 | 0 | 0.003 | 0 | 0 | 0.001 | 0.032 | 0 | 0.008 | 0 | 0.003 | 0.002 | 0.001 | 0 |
| 628.0 | 0 | 0.002 | 0 | 0.001 | 0.002 | 0.031 | 0 | 0.004 | 0 | 0.003 | 0 | 0.002 | 0 |
| 629.0 | 0 | 0.003 | 0 | 0 | 0.002 | 0.027 | 0 | 0.003 | 0.001 | 0.002 | 0 | 0.001 | 0.001 |
| 630.0 | 0 | 0.006 | 0 | 0.001 | 0.002 | 0.026 | 0.002 | 0.007 | 0.006 | 0.002 | 0 | 0 | 0.003 |
| 631.0 | 0 | 0.005 | 0 | 0.001 | 0.002 | 0.031 | 0.004 | 0.008 | 0 | 0.005 | 0 | 0 | 0.002 |
| 632.0 | 0 | 0 | 0 | 0 | 0.002 | 0.032 | 0.002 | 0.01 | 0 | 0.004 | 0.002 | 0 | 0.001 |
| 633.0 | 0 | 0 | 0 | 0 | 0.002 | 0.028 | 0.004 | 0.008 | 0.003 | 0.004 | 0.001 | 0 | 0 |
| 634.0 | 0 | 0.001 | 0 | 0 | 0.002 | 0.027 | 0.009 | 0.01 | 0 | 0.005 | 0 | 0 | 0.001 |
| 635.0 | 0 | 0.002 | 0 | 0 | 0.003 | 0.025 | 0.007 | 0.007 | 0 | 0.002 | 0 | 0.001 | 0.002 |
| 636.0 | 0 | 0.002 | 0 | 0.002 | 0.003 | 0.026 | 0 | 0 | 0.001 | 0.001 | 0 | 0.002 | 0 |
| 637.0 | 0 | 0.002 | 0 | 0.002 | 0.002 | 0.034 | 0.002 | 0 | 0.001 | 0.002 | 0 | 0.002 | 0 |
| 638.0 | 0 | 0.001 | 0 | 0.001 | 0 | 0.041 | 0.009 | 0.006 | 0 | 0.003 | 0 | 0.001 | 0 |
| 639.0 | 0 | 0.002 | 0 | 0.001 | 0 | 0.034 | 0.004 | 0.01 | 0 | 0.005 | 0.003 | 0.001 | 0 |
| 640.0 | 0 | 0.002 | 0 | 0.001 | 0 | 0.029 | 0.001 | 0.005 | 0 | 0.004 | 0.002 | 0 | 0 |
| 641.0 | 0 | 0.002 | 0 | 0.001 | 0.001 | 0.034 | 0.004 | 0.008 | 0 | 0.001 | 0.001 | 0.001 | 0 |
| 642.0 | 0 | 0.002 | 0 | 0 | 0.002 | 0.038 | 0.006 | 0.006 | 0 | 0.002 | 0 | 0.002 | 0 |
| 643.0 | 0 | 0.001 | 0 | 0 | 0.002 | 0.038 | 0.008 | 0.002 | 0 | 0.005 | 0 | 0.001 | 0 |
| 644.0 | 0 | 0.002 | 0 | 0 | 0.001 | 0.031 | 0.005 | 0 | 0 | 0.003 | 0 | 0 | 0 |
| 645.0 | 0 | 0.004 | 0 | 0 | 0.001 | 0.033 | 0.007 | 0 | 0 | 0 | 0.001 | 0 | 0 |
| 646.0 | 0 | 0.004 | 0 | 0.001 | 0.002 | 0.036 | 0.011 | 0 | 0 | 0 | 0 | 0.001 | 0 |
| 647.0 | 0 | 0.002 | 0 | 0.001 | 0.001 | 0.034 | 0.009 | 0 | 0 | 0 | 0 | 0.001 | 0 |
| 648.0 | 0 | 0 | 0 | 0 | 0.001 | 0.032 | 0.011 | 0.003 | 0 | 0 | 0 | 0.001 | 0 |
| 649.0 | 0 | 0 | 0 | 0 | 0.001 | 0.028 | 0.012 | 0.002 | 0 | 0.002 | 0 | 0.002 | 0.001 |
| 650.0 | 0 | 0.001 | 0 | 0.001 | 0 | 0.032 | 0.005 | 0.004 | 0 | 0.005 | 0 | 0.001 | 0.002 |
| 651.0 | 0 | 0.003 | 0 | 0 | 0 | 0.042 | 0.006 | 0.001 | 0 | 0.003 | 0 | 0 | 0.002 |
| 652.0 | 0 | 0.002 | 0 | 0 | 0.001 | 0.042 | 0.003 | 0 | 0 | 0 | 0 | 0 | 0.001 |
| 653.0 | 0 | 0.001 | 0 | 0 | 0.002 | 0.037 | 0 | 0 | 0 | 0.001 | 0 | 0 | 0 |
| 654.0 | 0 | 0.003 | 0 | 0 | 0.002 | 0.036 | 0.002 | 0 | 0.005 | 0.003 | 0 | 0 | 0.001 |
| 655.0 | 0 | 0.005 | 0 | 0 | 0.002 | 0.034 | 0.007 | 0.001 | 0.003 | 0.003 | 0 | 0 | 0.001 |
| 656.0 | 0 | 0.003 | 0 | 0.001 | 0.001 | 0.026 | 0.009 | 0.002 | 0.001 | 0.004 | 0 | 0 | 0 |
| 657.0 | 0 | 0.002 | 0 | 0.002 | 0.002 | 0.03 | 0.011 | 0.001 | 0 | 0.004 | 0 | 0 | 0 |
| 658.0 | 0 | 0.001 | 0 | 0.002 | 0.003 | 0.035 | 0.009 | 0.001 | 0 | 0.003 | 0 | 0 | 0 |
| 659.0 | 0 | 0 | 0 | 0.002 | 0.001 | 0.036 | 0.01 | 0.005 | 0 | 0.001 | 0 | 0.001 | 0 |
| 660.0 | 0 | 0 | 0 | 0.001 | 0 | 0.043 | 0.012 | 0.008 | 0 | 0 | 0 | 0.002 | 0 |
| 661.0 | 0 | 0.001 | 0 | 0 | 0.001 | 0.043 | 0.008 | 0.002 | 0 | 0 | 0 | 0.002 | 0 |
| 662.0 | 0 | 0.003 | 0 | 0 | 0 | 0.041 | 0.008 | 0 | 0 | 0 | 0 | 0.002 | 0 |
| 663.0 | 0 | 0 | 0 | 0 | 0 | 0.037 | 0.011 | 0 | 0 | 0.001 | 0.002 | 0.002 | 0 |
| 664.0 | 0 | 0 | 0 | 0 | 0 | 0.035 | 0.009 | 0 | 0 | 0.002 | 0.001 | 0 | 0 |
| 665.0 | 0 | 0 | 0 | 0 | 0 | 0.035 | 0.011 | 0.003 | 0 | 0.004 | 0.003 | 0 | 0 |
| 666.0 | 0 | 0.004 | 0 | 0 | 0 | 0.038 | 0.011 | 0.007 | 0 | 0.003 | 0.001 | 0 | 0.001 |
| 667.0 | 0 | 0.004 | 0 | 0 | 0 | 0.043 | 0.006 | 0.011 | 0 | 0.001 | 0 | 0.002 | 0.001 |
| 668.0 | 0 | 0.002 | 0 | 0.001 | 0.001 | 0.043 | 0.003 | 0.004 | 0 | 0.003 | 0 | 0.001 | 0.001 |
| 669.0 | 0 | 0 | 0 | 0.001 | 0.002 | 0.032 | 0.002 | 0 | 0 | 0.004 | 0 | 0.001 | 0 |
| 670.0 | 0 | 0 | 0 | 0.001 | 0 | 0.032 | 0.004 | 0.006 | 0 | 0.003 | 0 | 0 | 0 |
| 671.0 | 0 | 0.001 | 0 | 0.003 | 0 | 0.038 | 0.007 | 0.008 | 0.002 | 0.003 | 0 | 0 | 0 |
| 672.0 | 0 | 0.001 | 0 | 0.002 | 0 | 0.041 | 0.004 | 0 | 0 | 0.005 | 0 | 0 | 0 |
| 673.0 | 0 | 0.002 | 0 | 0 | 0.001 | 0.041 | 0.006 | 0 | 0 | 0.005 | 0 | 0.003 | 0 |
| 674.0 | 0 | 0 | 0 | 0 | 0.001 | 0.04 | 0.006 | 0.003 | 0 | 0.002 | 0.001 | 0.004 | 0.003 |
| 675.0 | 0 | 0 | 0 | 0.001 | 0 | 0.043 | 0.005 | 0 | 0 | 0.001 | 0 | 0.001 | 0.001 |
| 676.0 | 0 | 0 | 0 | 0 | 0.001 | 0.042 | 0.005 | 0 | 0 | 0 | 0 | 0.002 | 0 |
| 677.0 | 0 | 0.004 | 0 | 0 | 0.001 | 0.043 | 0.005 | 0.001 | 0 | 0.001 | 0 | 0.001 | 0.001 |
| 678.0 | 0 | 0.003 | 0 | 0 | 0 | 0.043 | 0.004 | 0.005 | 0 | 0.001 | 0 | 0 | 0 |
| 679.0 | 0 | 0 | 0 | 0.001 | 0 | 0.038 | 0.008 | 0.008 | 0.001 | 0.001 | 0 | 0.001 | 0 |
| 680.0 | 0 | 0 | 0 | 0 | 0 | 0.042 | 0.018 | 0.004 | 0.001 | 0.002 | 0 | 0.001 | 0 |
| 681.0 | 0 | 0.003 | 0 | 0 | 0 | 0.043 | 0.017 | 0 | 0 | 0.003 | 0 | 0 | 0.001 |
| 682.0 | 0 | 0.004 | 0 | 0 | 0 | 0.04 | 0.005 | 0.002 | 0.001 | 0.003 | 0 | 0 | 0.001 |
| 683.0 | 0 | 0.001 | 0 | 0 | 0 | 0.044 | 0.004 | 0.003 | 0.006 | 0.003 | 0 | 0.001 | 0 |
| 684.0 | 0 | 0 | 0 | 0 | 0.002 | 0.035 | 0.003 | 0.002 | 0 | 0.004 | 0 | 0 | 0.001 |
| 685.0 | 0 | 0 | 0 | 0 | 0.003 | 0.031 | 0.003 | 0.007 | 0 | 0.003 | 0 | 0 | 0.001 |
| 686.0 | 0 | 0 | 0 | 0 | 0.003 | 0.041 | 0.007 | 0.013 | 0 | 0.004 | 0.001 | 0 | 0.003 |
| 687.0 | 0 | 0.001 | 0 | 0.001 | 0.002 | 0.039 | 0.005 | 0.012 | 0 | 0.005 | 0.003 | 0 | 0.004 |
| 688.0 | 0 | 0.003 | 0 | 0 | 0.003 | 0.039 | 0.004 | 0.006 | 0 | 0.004 | 0 | 0 | 0.005 |
| 689.0 | 0 | 0.001 | 0 | 0 | 0.004 | 0.048 | 0.008 | 0.002 | 0 | 0.003 | 0 | 0 | 0.004 |
| 690.0 | 0 | 0 | 0 | 0 | 0.004 | 0.046 | 0.005 | 0.003 | 0.001 | 0 | 0 | 0 | 0.004 |
| 691.0 | 0 | 0.001 | 0 | 0 | 0.004 | 0.047 | 0.008 | 0.006 | 0.002 | 0 | 0 | 0.001 | 0.005 |
| 692.0 | 0 | 0.002 | 0 | 0 | 0.004 | 0.05 | 0.01 | 0.001 | 0 | 0 | 0 | 0 | 0.006 |
| 693.0 | 0 | 0.001 | 0 | 0 | 0.003 | 0.045 | 0.004 | 0 | 0 | 0.001 | 0 | 0 | 0.007 |
| 694.0 | 0 | 0.002 | 0 | 0 | 0.004 | 0.044 | 0 | 0.002 | 0 | 0.002 | 0 | 0.001 | 0.009 |
| 695.0 | 0 | 0.002 | 0 | 0 | 0.005 | 0.048 | 0.003 | 0 | 0 | 0.001 | 0 | 0.002 | 0.011 |
| 696.0 | 0 | 0 | 0 | 0 | 0.004 | 0.045 | 0.012 | 0.001 | 0 | 0.001 | 0 | 0.002 | 0.011 |
| 697.0 | 0 | 0 | 0 | 0 | 0.003 | 0.04 | 0.008 | 0.001 | 0 | 0.001 | 0 | 0.002 | 0.009 |
| 698.0 | 0 | 0 | 0 | 0 | 0.004 | 0.036 | 0.004 | 0.002 | 0 | 0.002 | 0 | 0 | 0.011 |
| 699.0 | 0 | 0 | 0 | 0 | 0.005 | 0.032 | 0.001 | 0.005 | 0 | 0 | 0 | 0 | 0.009 |
| 700.0 | 0 | 0 | 0 | 0 | 0.005 | 0.032 | 0.001 | 0.005 | 0 | 0 | 0 | 0 | 0.007 |